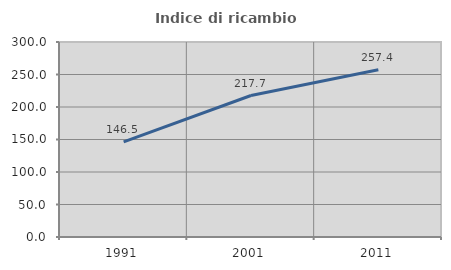
| Category | Indice di ricambio occupazionale  |
|---|---|
| 1991.0 | 146.479 |
| 2001.0 | 217.692 |
| 2011.0 | 257.432 |